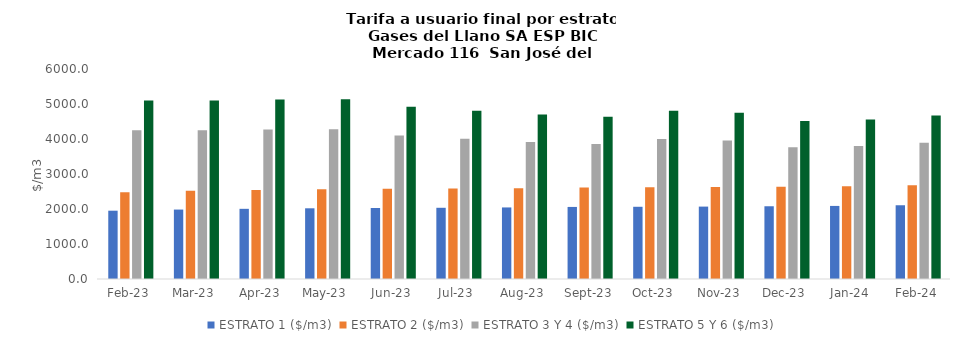
| Category | ESTRATO 1 ($/m3) | ESTRATO 2 ($/m3) | ESTRATO 3 Y 4 ($/m3) | ESTRATO 5 Y 6 ($/m3) |
|---|---|---|---|---|
| 2023-02-01 | 1951.54 | 2475.41 | 4250.37 | 5100.444 |
| 2023-03-01 | 1984.02 | 2519.25 | 4250.37 | 5100.444 |
| 2023-04-01 | 2005.09 | 2546.01 | 4273.76 | 5128.512 |
| 2023-05-01 | 2020.1 | 2565.07 | 4279.7 | 5135.64 |
| 2023-06-01 | 2028.44 | 2575.66 | 4098.64 | 4918.368 |
| 2023-07-01 | 2034.66 | 2583.55 | 4008.82 | 4810.584 |
| 2023-08-01 | 2044.67 | 2596.26 | 3914.14 | 4696.968 |
| 2023-09-01 | 2059.07 | 2614.55 | 3860.26 | 4632.312 |
| 2023-10-01 | 2063.47 | 2620.13 | 4003.57 | 4804.284 |
| 2023-11-01 | 2068.62 | 2626.68 | 3959.2 | 4751.04 |
| 2023-12-01 | 2078.32 | 2639 | 3760.95 | 4513.14 |
| 2024-01-01 | 2087.87 | 2651.13 | 3797.87 | 4557.444 |
| 2024-02-01 | 2106.97 | 2675.39 | 3890.75 | 4668.9 |